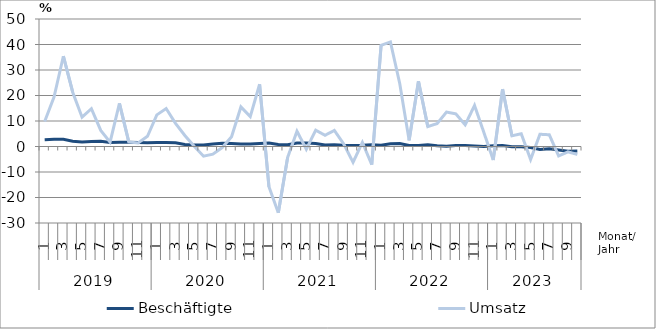
| Category | Beschäftigte | Umsatz |
|---|---|---|
| 0 | 2.6 | 9.8 |
| 1 | 2.8 | 19.4 |
| 2 | 2.8 | 35.4 |
| 3 | 2.1 | 21.3 |
| 4 | 1.8 | 11.5 |
| 5 | 2 | 14.8 |
| 6 | 2.1 | 6.3 |
| 7 | 1.6 | 1.7 |
| 8 | 1.7 | 16.9 |
| 9 | 1.7 | 1.8 |
| 10 | 1.6 | 1.4 |
| 11 | 1.5 | 4 |
| 12 | 1.6 | 12.4 |
| 13 | 1.6 | 14.9 |
| 14 | 1.5 | 9.1 |
| 15 | 0.8 | 4.3 |
| 16 | 0.6 | 0.1 |
| 17 | 0.6 | -3.8 |
| 18 | 1 | -3 |
| 19 | 1.3 | -0.4 |
| 20 | 1.2 | 3.8 |
| 21 | 1 | 15.5 |
| 22 | 1 | 11.7 |
| 23 | 1.2 | 24.4 |
| 24 | 1.4 | -15.8 |
| 25 | 0.8 | -26 |
| 26 | 0.7 | -4.3 |
| 27 | 1.4 | 6 |
| 28 | 1.4 | -1.1 |
| 29 | 1.2 | 6.4 |
| 30 | 0.6 | 4.4 |
| 31 | 0.7 | 6.3 |
| 32 | 0.5 | 1 |
| 33 | 0.4 | -6.2 |
| 34 | 0.5 | 1.6 |
| 35 | 0.7 | -7.1 |
| 36 | 0.5 | 39.7 |
| 37 | 1.1 | 41 |
| 38 | 1.2 | 24.6 |
| 39 | 0.4 | 2.4 |
| 40 | 0.4 | 25.6 |
| 41 | 0.7 | 7.8 |
| 42 | 0.3 | 9 |
| 43 | 0.1 | 13.5 |
| 44 | 0.4 | 12.8 |
| 45 | 0.4 | 8.5 |
| 46 | 0.2 | 16.1 |
| 47 | 0 | 5.5 |
| 48 | 0.3 | -5.3 |
| 49 | 0.4 | 22.5 |
| 50 | -0.1 | 4.2 |
| 51 | -0.1 | 5 |
| 52 | -0.4 | -5.1 |
| 53 | -1.2 | 4.8 |
| 54 | -0.9 | 4.6 |
| 55 | -1.4 | -3.7 |
| 56 | -1.9 | -2.1 |
| 57 | -1.8 | -3.1 |